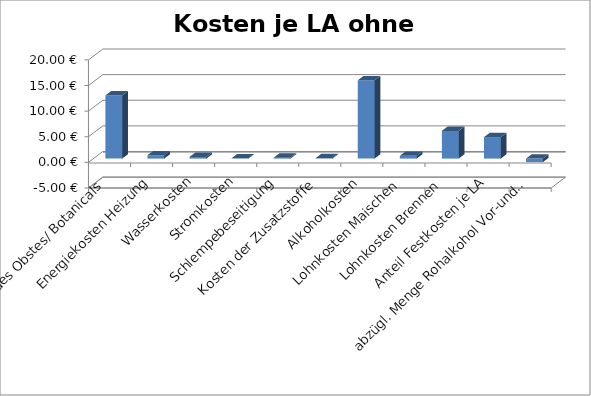
| Category | Kosten je LA ohne Vermarktung |
|---|---|
| Kosten des Obstes/ Botanicals | 12.324 |
| Energiekosten Heizung | 0.649 |
| Wasserkosten | 0.324 |
| Stromkosten | 0.065 |
| Schlempebeseitigung | 0.173 |
| Kosten der Zusatzstoffe | 0.108 |
| Alkoholkosten | 15.277 |
| Lohnkosten Maischen | 0.541 |
| Lohnkosten Brennen | 5.405 |
| Anteil Festkosten je LA | 4.179 |
| abzügl. Menge Rohalkohol Vor-und Nachl. f. nächsten Abtrieb o. Verkauf | -0.69 |